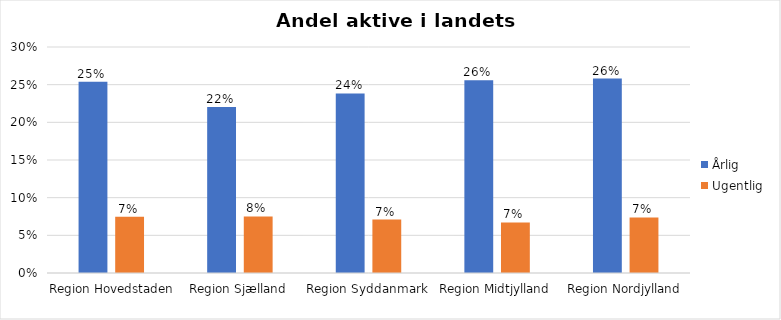
| Category | Årlig | Ugentlig |
|---|---|---|
| Region Hovedstaden | 0.254 | 0.075 |
| Region Sjælland | 0.22 | 0.075 |
| Region Syddanmark | 0.238 | 0.071 |
| Region Midtjylland | 0.256 | 0.067 |
| Region Nordjylland | 0.258 | 0.074 |